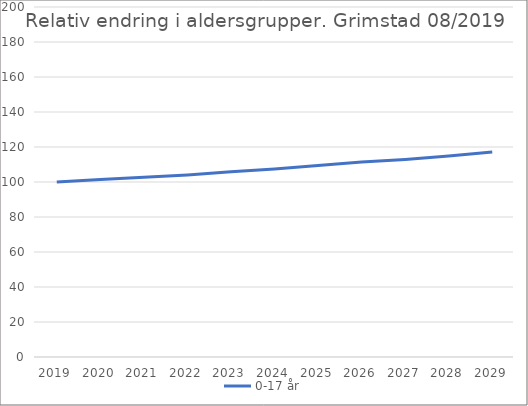
| Category | 0-17 år |
|---|---|
| 2019 | 100 |
| 2020 | 101.422 |
| 2021 | 102.668 |
| 2022 | 104.03 |
| 2023 | 105.809 |
| 2024 | 107.474 |
| 2025 | 109.495 |
| 2026 | 111.379 |
| 2027 | 112.906 |
| 2028 | 114.904 |
| 2029 | 117.152 |